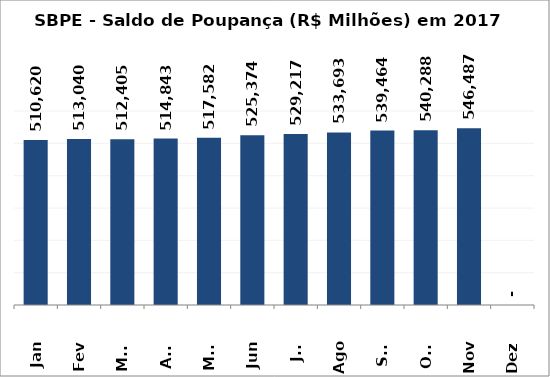
| Category | SBPE - Saldo de Poupança (R$ Milhões) em 2017 |
|---|---|
| Jan | 510620.427 |
| Fev | 513039.9 |
| Mar | 512404.875 |
| Abr | 514843.384 |
| Mai | 517582.001 |
| Jun | 525374.293 |
| Jul | 529217.404 |
| Ago | 533693.395 |
| Set | 539463.602 |
| Out | 540287.704 |
| Nov | 546487.327 |
| Dez | 0 |